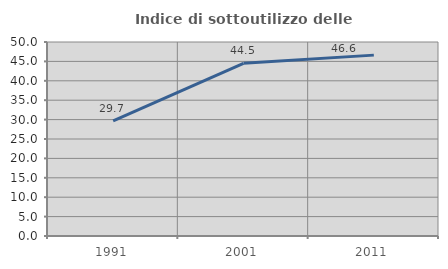
| Category | Indice di sottoutilizzo delle abitazioni  |
|---|---|
| 1991.0 | 29.651 |
| 2001.0 | 44.507 |
| 2011.0 | 46.617 |